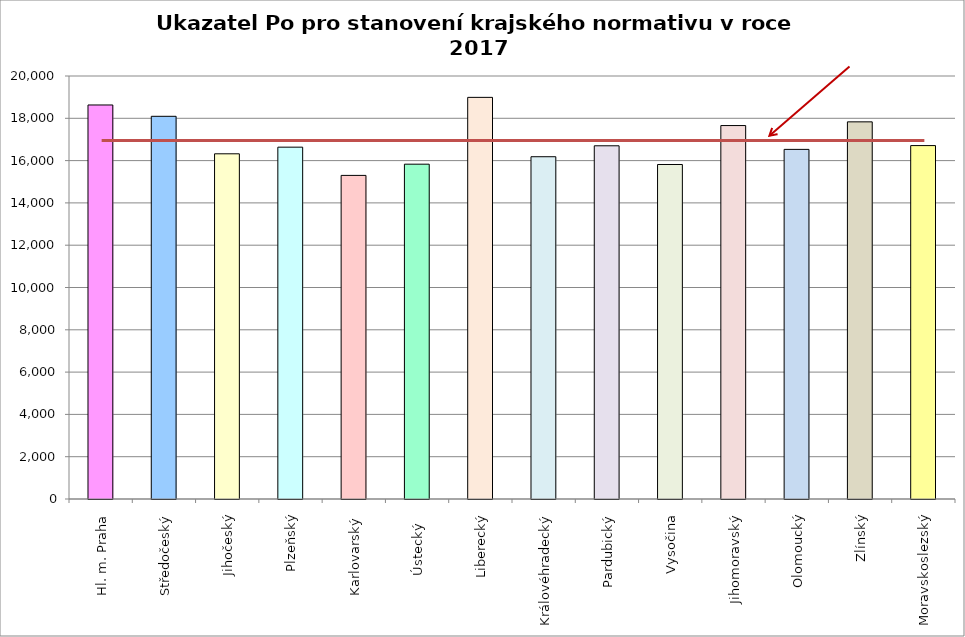
| Category | Series 0 |
|---|---|
| Hl. m. Praha | 18630 |
| Středočeský | 18094.2 |
| Jihočeský | 16321 |
| Plzeňský | 16635 |
| Karlovarský  | 15300 |
| Ústecký   | 15831 |
| Liberecký | 18990 |
| Královéhradecký | 16183 |
| Pardubický | 16700 |
| Vysočina | 15816 |
| Jihomoravský | 17657 |
| Olomoucký | 16530 |
| Zlínský | 17832 |
| Moravskoslezský | 16710 |